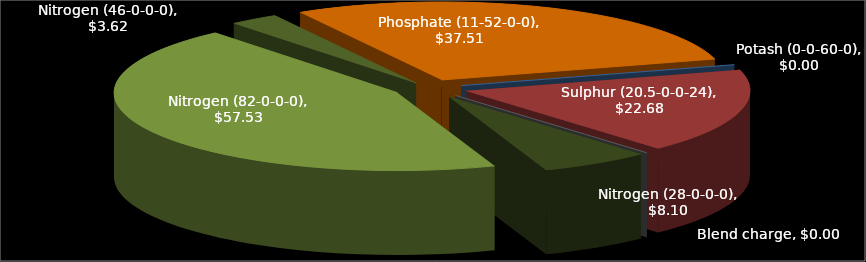
| Category | Series 0 |
|---|---|
| 0 | 57.53 |
| 1 | 3.624 |
| 2 | 37.509 |
| 3 | 0 |
| 4 | 22.68 |
| 5 | 0 |
| 6 | 8.1 |